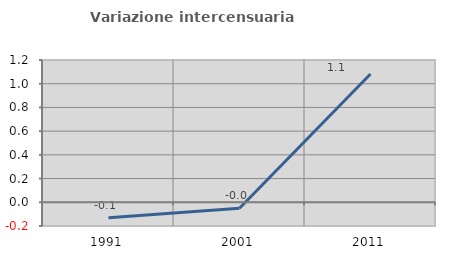
| Category | Variazione intercensuaria annua |
|---|---|
| 1991.0 | -0.131 |
| 2001.0 | -0.05 |
| 2011.0 | 1.082 |